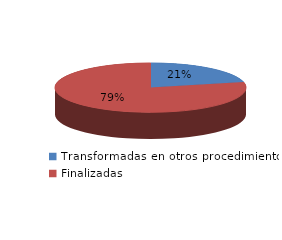
| Category | Series 0 |
|---|---|
| Transformadas en otros procedimientos | 2241 |
| Finalizadas | 8227 |